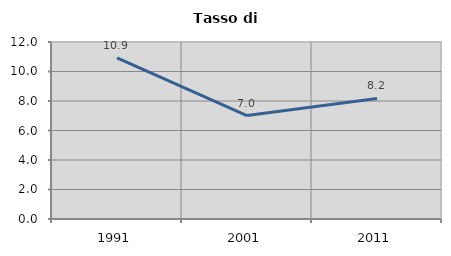
| Category | Tasso di disoccupazione   |
|---|---|
| 1991.0 | 10.922 |
| 2001.0 | 7.015 |
| 2011.0 | 8.172 |